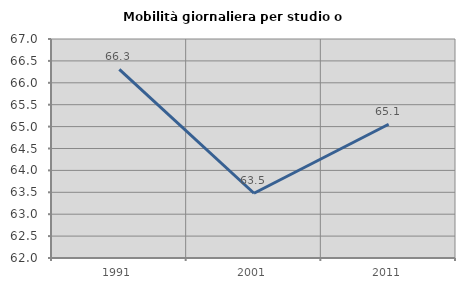
| Category | Mobilità giornaliera per studio o lavoro |
|---|---|
| 1991.0 | 66.308 |
| 2001.0 | 63.478 |
| 2011.0 | 65.054 |